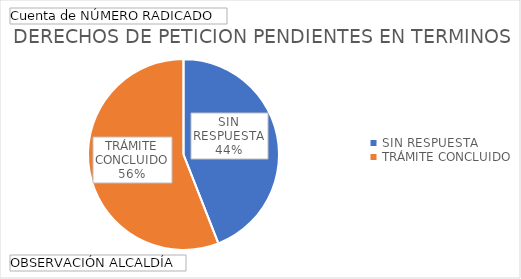
| Category | Total |
|---|---|
| SIN RESPUESTA | 37 |
| TRÁMITE CONCLUIDO | 47 |